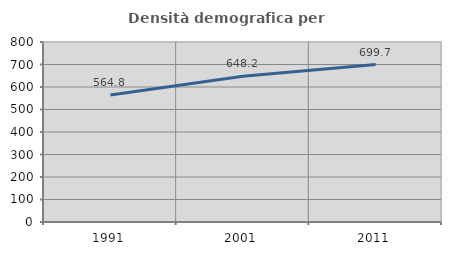
| Category | Densità demografica |
|---|---|
| 1991.0 | 564.84 |
| 2001.0 | 648.197 |
| 2011.0 | 699.712 |